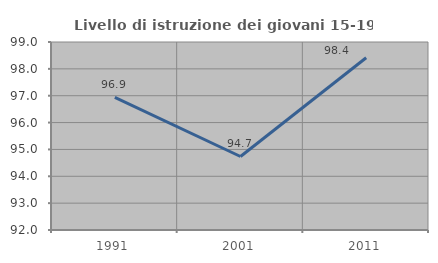
| Category | Livello di istruzione dei giovani 15-19 anni |
|---|---|
| 1991.0 | 96.939 |
| 2001.0 | 94.737 |
| 2011.0 | 98.413 |